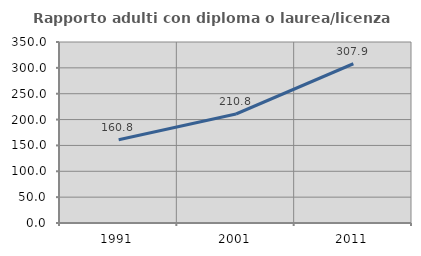
| Category | Rapporto adulti con diploma o laurea/licenza media  |
|---|---|
| 1991.0 | 160.808 |
| 2001.0 | 210.774 |
| 2011.0 | 307.948 |